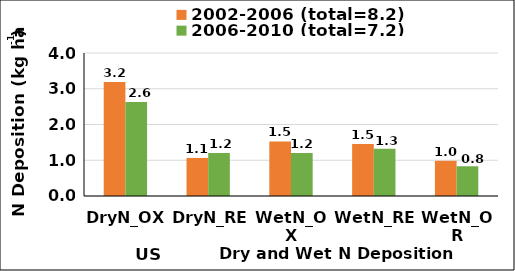
| Category | 2002-2006 (total=8.2) | 2006-2010 (total=7.2) |
|---|---|---|
| DryN_OX | 3.188 | 2.631 |
| DryN_RE | 1.065 | 1.205 |
| WetN_OX | 1.526 | 1.204 |
| WetN_RE | 1.457 | 1.318 |
| WetN_OR | 0.984 | 0.832 |